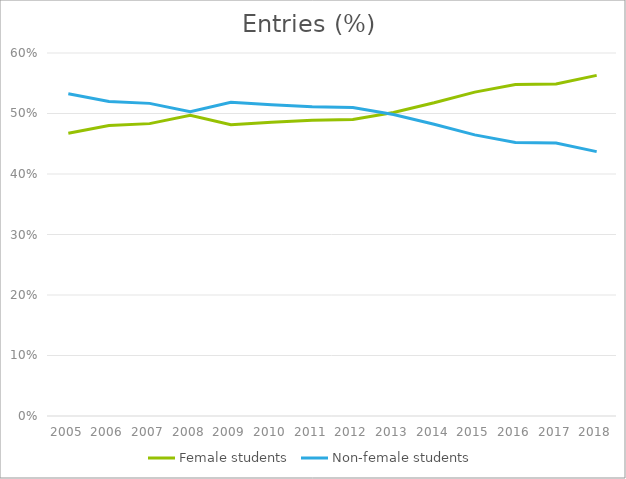
| Category | Female students | Non-female students |
|---|---|---|
| 2005.0 | 0.467 | 0.533 |
| 2006.0 | 0.48 | 0.52 |
| 2007.0 | 0.483 | 0.517 |
| 2008.0 | 0.497 | 0.503 |
| 2009.0 | 0.481 | 0.519 |
| 2010.0 | 0.485 | 0.515 |
| 2011.0 | 0.489 | 0.511 |
| 2012.0 | 0.49 | 0.51 |
| 2013.0 | 0.502 | 0.498 |
| 2014.0 | 0.518 | 0.482 |
| 2015.0 | 0.535 | 0.465 |
| 2016.0 | 0.548 | 0.452 |
| 2017.0 | 0.549 | 0.451 |
| 2018.0 | 0.563 | 0.437 |